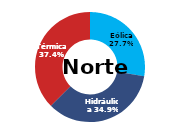
| Category | Norte |
|---|---|
| Eólica | 90.913 |
| Hidráulica | 114.571 |
| Solar | 0 |
| Térmica | 122.746 |